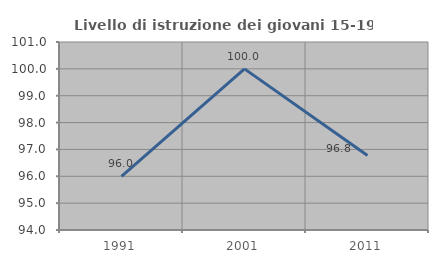
| Category | Livello di istruzione dei giovani 15-19 anni |
|---|---|
| 1991.0 | 96 |
| 2001.0 | 100 |
| 2011.0 | 96.774 |